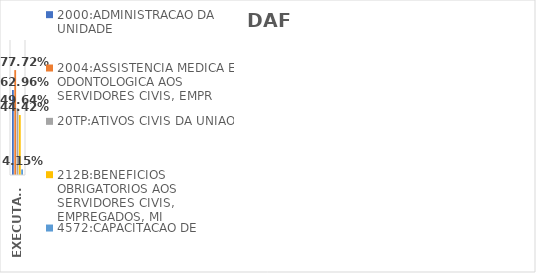
| Category | 2000:ADMINISTRACAO DA UNIDADE | 2004:ASSISTENCIA MEDICA E ODONTOLOGICA AOS SERVIDORES CIVIS, EMPR | 20TP:ATIVOS CIVIS DA UNIAO | 212B:BENEFICIOS OBRIGATORIOS AOS SERVIDORES CIVIS, EMPREGADOS, MI | 4572:CAPACITACAO DE SERVIDORES PUBLICOS FEDERAIS EM PROCESSO DE Q |
|---|---|---|---|---|---|
| EXECUTADO | 0.63 | 0.777 | 0.496 | 0.444 | 0.042 |